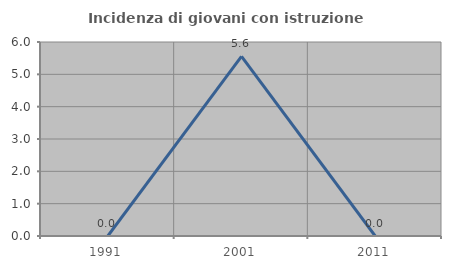
| Category | Incidenza di giovani con istruzione universitaria |
|---|---|
| 1991.0 | 0 |
| 2001.0 | 5.556 |
| 2011.0 | 0 |